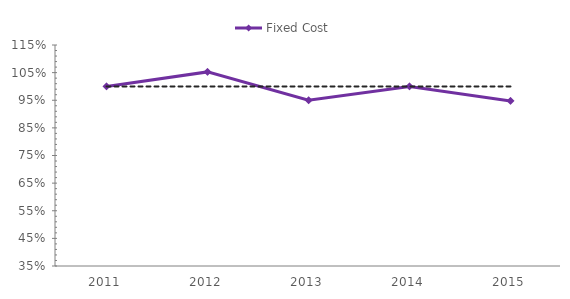
| Category | Fixed Cost | Target Line |
|---|---|---|
| 2011 | 1 | 1 |
| 2012 | 1.053 | 1 |
| 2013 | 0.95 | 1 |
| 2014 | 1 | 1 |
| 2015 | 0.947 | 1 |